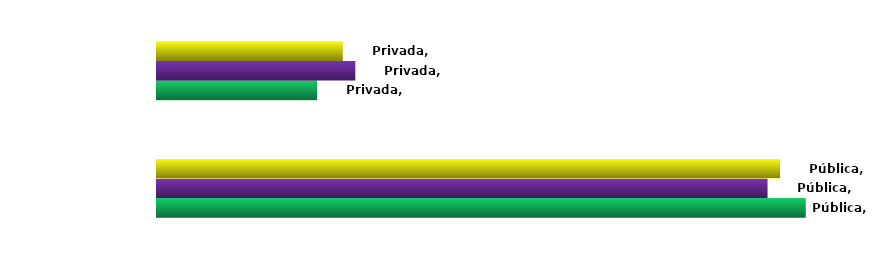
| Category | Ingressantes | Concluintes | Matriculados |
|---|---|---|---|
| Pública | 0.802 | 0.755 | 0.77 |
| Privada | 0.198 | 0.245 | 0.23 |